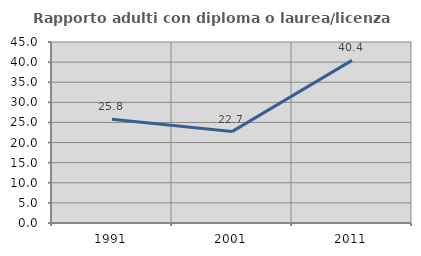
| Category | Rapporto adulti con diploma o laurea/licenza media  |
|---|---|
| 1991.0 | 25.806 |
| 2001.0 | 22.727 |
| 2011.0 | 40.426 |